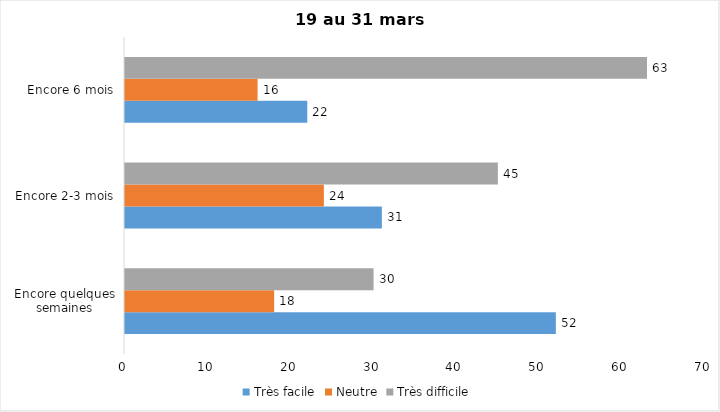
| Category | Très facile | Neutre | Très difficile |
|---|---|---|---|
| Encore quelques semaines | 52 | 18 | 30 |
| Encore 2-3 mois | 31 | 24 | 45 |
| Encore 6 mois | 22 | 16 | 63 |